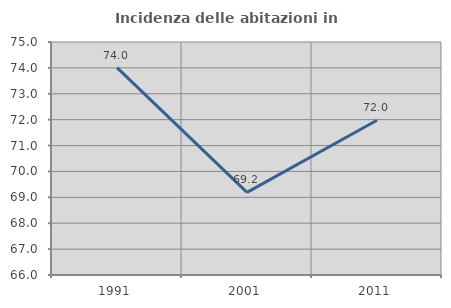
| Category | Incidenza delle abitazioni in proprietà  |
|---|---|
| 1991.0 | 74.011 |
| 2001.0 | 69.189 |
| 2011.0 | 71.978 |